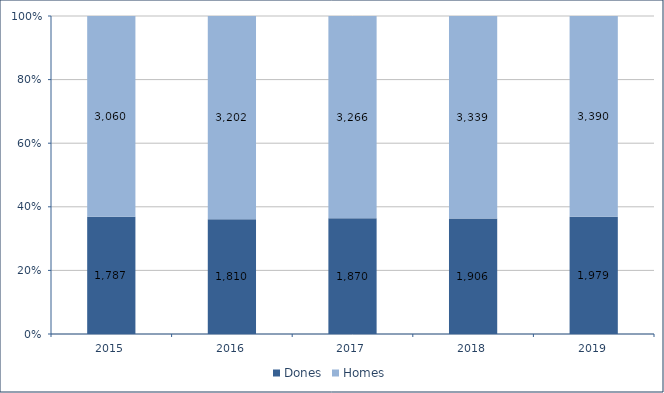
| Category | Dones | Homes |
|---|---|---|
| 2015.0 | 1787 | 3060 |
| 2016.0 | 1810 | 3202 |
| 2017.0 | 1870 | 3266 |
| 2018.0 | 1906 | 3339 |
| 2019.0 | 1979 | 3390 |